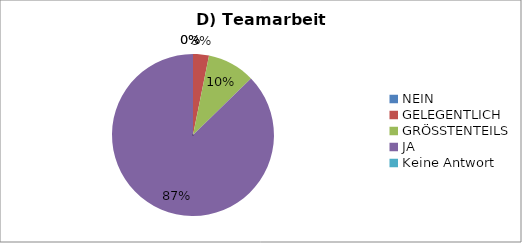
| Category | Series 0 |
|---|---|
| NEIN | 0 |
| GELEGENTLICH | 2 |
| GRÖSSTENTEILS | 6 |
| JA | 55 |
| Keine Antwort | 0 |